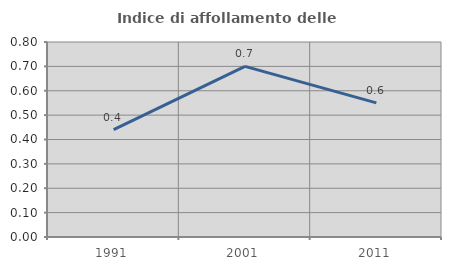
| Category | Indice di affollamento delle abitazioni  |
|---|---|
| 1991.0 | 0.441 |
| 2001.0 | 0.7 |
| 2011.0 | 0.55 |